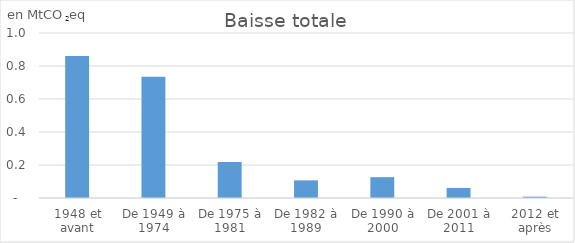
| Category | Baisse totale |
|---|---|
| 1948 et avant | 0.861 |
| De 1949 à 1974 | 0.735 |
| De 1975 à 1981 | 0.218 |
| De 1982 à 1989 | 0.107 |
| De 1990 à 2000 | 0.126 |
| De 2001 à 2011 | 0.061 |
| 2012 et après | 0.008 |